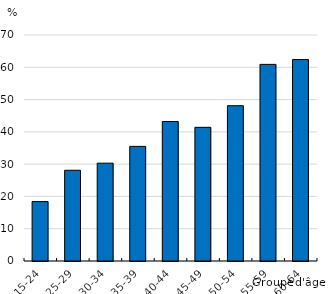
| Category | 2018 |
|---|---|
| 15-24 | 18.4 |
| 25-29 | 28.1 |
| 30-34 | 30.3 |
| 35-39 | 35.5 |
| 40-44 | 43.2 |
| 45-49 | 41.4 |
| 50-54 | 48.1 |
| 55-59 | 60.9 |
| 60-64 | 62.4 |